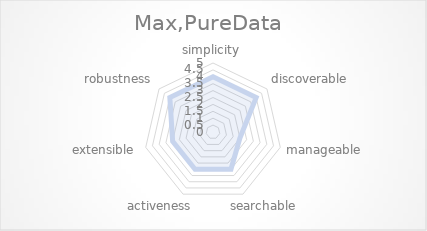
| Category | Max,PureData |
|---|---|
| simplicity | 4 |
| discoverable | 4 |
| manageable | 2 |
| searchable | 3 |
| activeness | 3 |
| extensible | 3 |
| robustness | 4 |